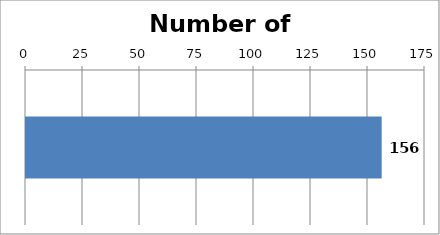
| Category | Series 0 |
|---|---|
| 0 | 156 |